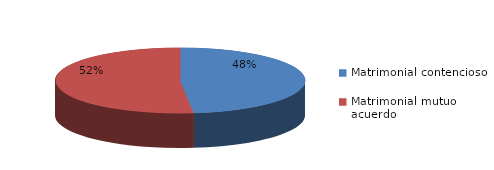
| Category | Series 0 |
|---|---|
| 0 | 362 |
| 1 | 388 |